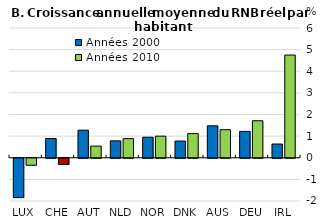
| Category | Années 2000 | Années 2010 |
|---|---|---|
| LUX | -1.817 | -0.322 |
| CHE | 0.891 | -0.287 |
| AUT | 1.274 | 0.539 |
| NLD | 0.782 | 0.885 |
| NOR | 0.949 | 0.998 |
| DNK | 0.773 | 1.116 |
| AUS | 1.476 | 1.297 |
| DEU | 1.219 | 1.712 |
| IRL | 0.635 | 4.75 |